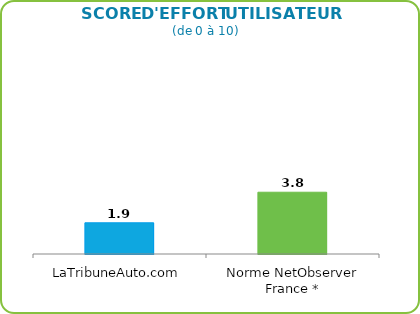
| Category | Score d'effort moyen |
|---|---|
| LaTribuneAuto.com | 1.926 |
| Norme NetObserver France * | 3.814 |